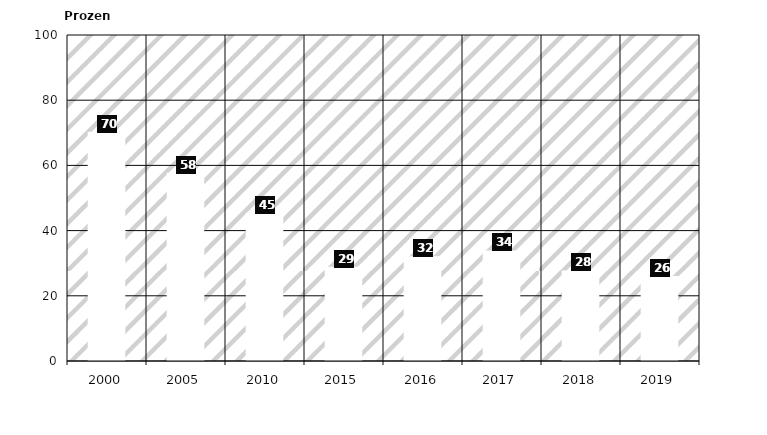
| Category | PINETI IV |
|---|---|
| 2000.0 | 70.328 |
| 2005.0 | 57.771 |
| 2010.0 | 45.458 |
| 2015.0 | 28.927 |
| 2016.0 | 32.17 |
| 2017.0 | 33.923 |
| 2018.0 | 27.779 |
| 2019.0 | 26.067 |